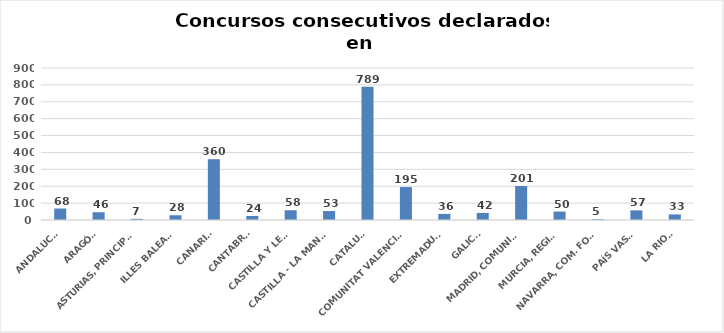
| Category | Series 0 |
|---|---|
| ANDALUCÍA | 68 |
| ARAGÓN | 46 |
| ASTURIAS, PRINCIPADO | 7 |
| ILLES BALEARS | 28 |
| CANARIAS | 360 |
| CANTABRIA | 24 |
| CASTILLA Y LEÓN | 58 |
| CASTILLA - LA MANCHA | 53 |
| CATALUÑA | 789 |
| COMUNITAT VALENCIANA | 195 |
| EXTREMADURA | 36 |
| GALICIA | 42 |
| MADRID, COMUNIDAD | 201 |
| MURCIA, REGIÓN | 50 |
| NAVARRA, COM. FORAL | 5 |
| PAÍS VASCO | 57 |
| LA RIOJA | 33 |